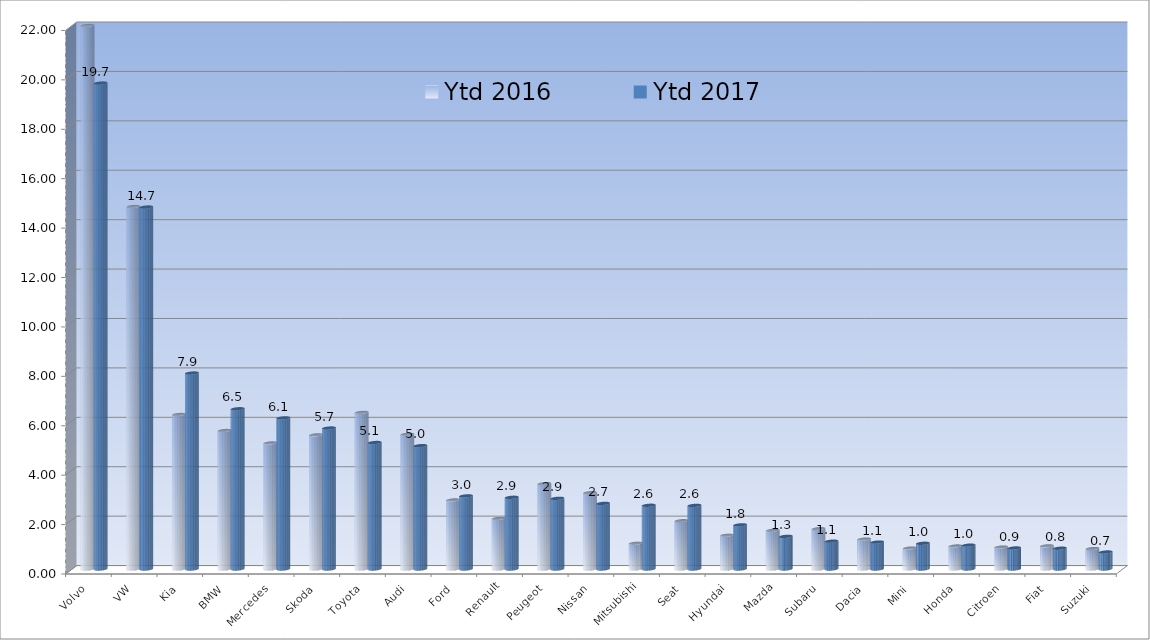
| Category | Ytd 2016 | Ytd 2017 |
|---|---|---|
| Volvo | 22.801 | 19.668 |
| VW | 14.67 | 14.65 |
| Kia | 6.254 | 7.931 |
| BMW | 5.605 | 6.485 |
| Mercedes | 5.101 | 6.116 |
| Skoda | 5.427 | 5.706 |
| Toyota | 6.338 | 5.119 |
| Audi | 5.451 | 4.993 |
| Ford | 2.793 | 2.957 |
| Renault | 2.048 | 2.902 |
| Peugeot | 3.455 | 2.861 |
| Nissan | 3.088 | 2.655 |
| Mitsubishi | 1.042 | 2.579 |
| Seat | 1.953 | 2.574 |
| Hyundai | 1.367 | 1.786 |
| Mazda | 1.564 | 1.32 |
| Subaru | 1.63 | 1.126 |
| Dacia | 1.209 | 1.089 |
| Mini | 0.847 | 1.041 |
| Honda | 0.93 | 0.965 |
| Citroen | 0.887 | 0.85 |
| Fiat | 0.934 | 0.841 |
| Suzuki | 0.827 | 0.688 |